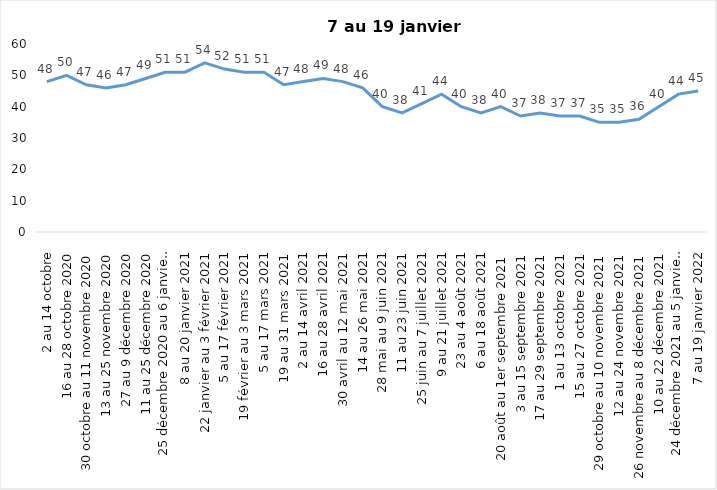
| Category | Toujours aux trois mesures |
|---|---|
| 2 au 14 octobre | 48 |
| 16 au 28 octobre 2020 | 50 |
| 30 octobre au 11 novembre 2020 | 47 |
| 13 au 25 novembre 2020 | 46 |
| 27 au 9 décembre 2020 | 47 |
| 11 au 25 décembre 2020 | 49 |
| 25 décembre 2020 au 6 janvier 2021 | 51 |
| 8 au 20 janvier 2021 | 51 |
| 22 janvier au 3 février 2021 | 54 |
| 5 au 17 février 2021 | 52 |
| 19 février au 3 mars 2021 | 51 |
| 5 au 17 mars 2021 | 51 |
| 19 au 31 mars 2021 | 47 |
| 2 au 14 avril 2021 | 48 |
| 16 au 28 avril 2021 | 49 |
| 30 avril au 12 mai 2021 | 48 |
| 14 au 26 mai 2021 | 46 |
| 28 mai au 9 juin 2021 | 40 |
| 11 au 23 juin 2021 | 38 |
| 25 juin au 7 juillet 2021 | 41 |
| 9 au 21 juillet 2021 | 44 |
| 23 au 4 août 2021 | 40 |
| 6 au 18 août 2021 | 38 |
| 20 août au 1er septembre 2021 | 40 |
| 3 au 15 septembre 2021 | 37 |
| 17 au 29 septembre 2021 | 38 |
| 1 au 13 octobre 2021 | 37 |
| 15 au 27 octobre 2021 | 37 |
| 29 octobre au 10 novembre 2021 | 35 |
| 12 au 24 novembre 2021 | 35 |
| 26 novembre au 8 décembre 2021 | 36 |
| 10 au 22 décembre 2021 | 40 |
| 24 décembre 2021 au 5 janvier 2022 | 44 |
| 7 au 19 janvier 2022 | 45 |